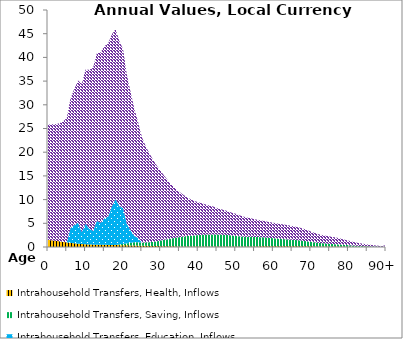
| Category | Intrahousehold Transfers, Health, Inflows | Intrahousehold Transfers, Saving, Inflows | Intrahousehold Transfers, Education, Inflows | Intrahousehold Transfers, Consumption other than health and education, Inflows |
|---|---|---|---|---|
| 0 | 1506.016 | 0.782 | 0 | 24291.04 |
|  | 1409.695 | 1.084 | 0 | 24479.458 |
| 2 | 1310.14 | 1.382 | 0 | 24607.26 |
| 3 | 1209.268 | 1.615 | 0 | 24871.059 |
| 4 | 1090.487 | 1.789 | 0 | 25398.74 |
| 5 | 973.118 | 1.549 | 0 | 26255.011 |
| 6 | 872.065 | 1.277 | 3100.136 | 27414.444 |
| 7 | 775.182 | 0.983 | 3865.664 | 28701.026 |
| 8 | 692.685 | 0.705 | 4459.565 | 29996.122 |
| 9 | 627.538 | 0.424 | 2493.641 | 31277.647 |
| 10 | 573.707 | 0.464 | 4376.675 | 32502.9 |
| 11 | 530.763 | 0.62 | 3319.297 | 33524.009 |
| 12 | 499.441 | 4.086 | 2880.649 | 34462.453 |
| 13 | 475.425 | 6.354 | 5053.534 | 35317.617 |
| 14 | 457.853 | 8.773 | 4615.059 | 35954.315 |
| 15 | 443.636 | 12.01 | 5593.207 | 36333.366 |
| 16 | 431.658 | 15.554 | 5947.094 | 36518.497 |
| 17 | 420.547 | 17.666 | 8101.308 | 36349.655 |
| 18 | 408.522 | 28.286 | 9717.667 | 35814.327 |
| 19 | 394.159 | 153.92 | 8042.827 | 34878.414 |
| 20 | 376.247 | 282.62 | 7581.793 | 33429.345 |
| 21 | 355.682 | 410.565 | 4102.576 | 31491.489 |
| 22 | 331.718 | 553.264 | 2609.739 | 29176.155 |
| 23 | 310.817 | 701.677 | 1326.584 | 26792.589 |
| 24 | 288.941 | 689.858 | 911.253 | 24422.253 |
| 25 | 268.861 | 695.172 | 0 | 22218.973 |
| 26 | 249.381 | 726.494 | 0 | 20310.915 |
| 27 | 232.152 | 772.653 | 0 | 18756.099 |
| 28 | 213.42 | 848.117 | 0 | 17292.952 |
| 29 | 196.132 | 1004.219 | 0 | 15927.255 |
| 30 | 180.02 | 1181.419 | 0 | 14667.98 |
| 31 | 164.993 | 1355.032 | 0 | 13468.198 |
| 32 | 151.374 | 1521.414 | 0 | 12311.528 |
| 33 | 139.185 | 1687.81 | 0 | 11248.484 |
| 34 | 128.654 | 1831.44 | 0 | 10346.851 |
| 35 | 118.396 | 1959.621 | 0 | 9547.117 |
| 36 | 109.516 | 2084.036 | 0 | 8834.065 |
| 37 | 101.978 | 2195.133 | 0 | 8200.865 |
| 38 | 96.735 | 2274.31 | 0 | 7685.985 |
| 39 | 93.275 | 2355.789 | 0 | 7249.293 |
| 40 | 92.516 | 2422.849 | 0 | 6949.465 |
| 41 | 93.203 | 2477.264 | 0 | 6633.106 |
| 42 | 94.481 | 2515.631 | 0 | 6365.874 |
| 43 | 94.658 | 2541.776 | 0 | 6126.364 |
| 44 | 93.674 | 2553.907 | 0 | 5901.512 |
| 45 | 92.091 | 2546.7 | 0 | 5568.875 |
| 46 | 92.22 | 2525.548 | 0 | 5365.56 |
| 47 | 93.954 | 2485.669 | 0 | 5196.601 |
| 48 | 96.157 | 2421.233 | 0 | 4998.306 |
| 49 | 100.806 | 2329.195 | 0 | 4782.012 |
| 50 | 106.387 | 2241.837 | 0 | 4656.953 |
| 51 | 109.362 | 2149.668 | 0 | 4437.762 |
| 52 | 110.598 | 2076.596 | 0 | 4229.074 |
| 53 | 113.458 | 2036.241 | 0 | 4062.152 |
| 54 | 118.484 | 2021.612 | 0 | 3918.25 |
| 55 | 122.9 | 1995.394 | 0 | 3737.599 |
| 56 | 130.001 | 1965.702 | 0 | 3623.189 |
| 57 | 137.231 | 1924.808 | 0 | 3506.229 |
| 58 | 142.998 | 1862.427 | 0 | 3402.548 |
| 59 | 145.076 | 1783.908 | 0 | 3318.793 |
| 60 | 148.687 | 1707.896 | 0 | 3262.007 |
| 61 | 151.004 | 1632.057 | 0 | 3198.306 |
| 62 | 152.577 | 1556.423 | 0 | 3131.588 |
| 63 | 154.976 | 1493.594 | 0 | 3066.005 |
| 64 | 157.245 | 1432.769 | 0 | 2984.968 |
| 65 | 157.157 | 1370.432 | 0 | 2899.202 |
| 66 | 157.72 | 1310.45 | 0 | 2807.776 |
| 67 | 156.492 | 1240.995 | 0 | 2696.063 |
| 68 | 151.479 | 1152.617 | 0 | 2542.221 |
| 69 | 144.48 | 1053.604 | 0 | 2365.154 |
| 70 | 136.875 | 953.223 | 0 | 2184.741 |
| 71 | 127.168 | 851.407 | 0 | 1994.603 |
| 72 | 118.868 | 759.162 | 0 | 1833.009 |
| 73 | 113.531 | 685.642 | 0 | 1716.952 |
| 74 | 109.943 | 627.564 | 0 | 1634.485 |
| 75 | 105.901 | 568.892 | 0 | 1548.751 |
| 76 | 102.101 | 514.685 | 0 | 1469.508 |
| 77 | 96.86 | 472.892 | 0 | 1372.407 |
| 78 | 88.887 | 421.494 | 0 | 1242.283 |
| 79 | 79.135 | 363.871 | 0 | 1090.069 |
| 80 | 69.73 | 312.261 | 0 | 947.127 |
| 81 | 60.282 | 260.843 | 0 | 807.673 |
| 82 | 51.507 | 209.986 | 0 | 680.593 |
| 83 | 44.1 | 168.798 | 0 | 574.835 |
| 84 | 37.766 | 141.474 | 0 | 485.759 |
| 85 | 31.495 | 117.692 | 0 | 399.982 |
| 86 | 25.466 | 94.776 | 0 | 319.597 |
| 87 | 20.16 | 74.803 | 0 | 250.249 |
| 88 | 15.721 | 57.867 | 0 | 193.22 |
| 89 | 12.058 | 42.564 | 0 | 146.819 |
| 90+ | 25.424 | 86.078 | 0 | 306.79 |